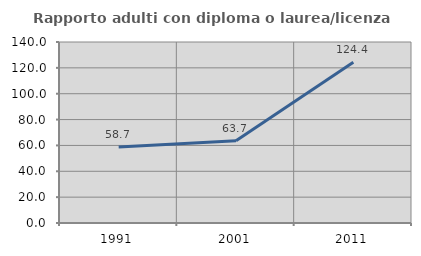
| Category | Rapporto adulti con diploma o laurea/licenza media  |
|---|---|
| 1991.0 | 58.737 |
| 2001.0 | 63.712 |
| 2011.0 | 124.419 |